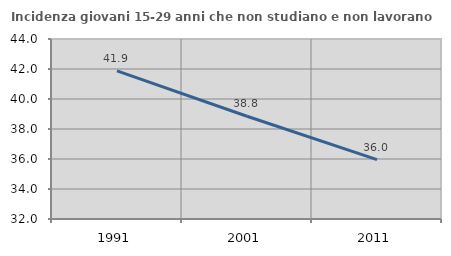
| Category | Incidenza giovani 15-29 anni che non studiano e non lavorano  |
|---|---|
| 1991.0 | 41.875 |
| 2001.0 | 38.848 |
| 2011.0 | 35.955 |